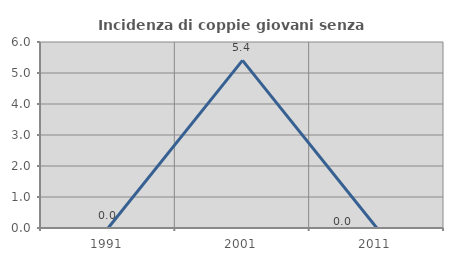
| Category | Incidenza di coppie giovani senza figli |
|---|---|
| 1991.0 | 0 |
| 2001.0 | 5.405 |
| 2011.0 | 0 |